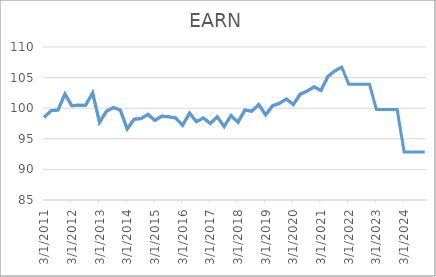
| Category | EARN | GDP |
|---|---|---|
| 3/31/11 | 98.5 |  |
| 6/30/11 | 99.6 |  |
| 9/30/11 | 99.7 |  |
| 12/31/11 | 102.3 |  |
| 3/31/12 | 100.4 |  |
| 6/30/12 | 100.5 |  |
| 9/30/12 | 100.5 |  |
| 12/31/12 | 102.5 |  |
| 3/31/13 | 97.7 |  |
| 6/30/13 | 99.5 |  |
| 9/30/13 | 100.1 |  |
| 12/31/13 | 99.7 |  |
| 3/31/14 | 96.6 |  |
| 6/30/14 | 98.2 |  |
| 9/30/14 | 98.3 |  |
| 12/31/14 | 99 |  |
| 3/31/15 | 98 |  |
| 6/30/15 | 98.7 |  |
| 9/30/15 | 98.6 |  |
| 12/31/15 | 98.4 |  |
| 3/31/16 | 97.2 |  |
| 6/30/16 | 99.2 |  |
| 9/30/16 | 97.8 |  |
| 12/31/16 | 98.4 |  |
| 3/31/17 | 97.5 |  |
| 6/30/17 | 98.6 |  |
| 9/30/17 | 97 |  |
| 12/31/17 | 98.8 |  |
| 3/31/18 | 97.7 |  |
| 6/30/18 | 99.7 |  |
| 9/30/18 | 99.5 |  |
| 12/31/18 | 100.6 |  |
| 3/31/19 | 98.9 |  |
| 6/30/19 | 100.4 |  |
| 9/30/19 | 100.8 |  |
| 12/31/19 | 101.5 |  |
| 3/31/20 | 100.6 |  |
| 6/30/20 | 102.3 |  |
| 9/30/20 | 102.8 |  |
| 12/31/20 | 103.5 |  |
| 3/31/21 | 102.9 |  |
| 6/30/21 | 105.2 |  |
| 9/30/21 | 106.1 |  |
| 12/31/21 | 106.7 |  |
| 3/31/22 | 103.926 |  |
| 6/30/22 | 103.926 |  |
| 9/30/22 | 103.926 |  |
| 12/31/22 | 103.926 |  |
| 3/31/23 | 99.788 |  |
| 6/30/23 | 99.788 |  |
| 9/30/23 | 99.788 |  |
| 12/31/23 | 99.788 |  |
| 3/31/24 | 92.864 |  |
| 6/30/24 | 92.864 |  |
| 9/30/24 | 92.864 |  |
| 12/31/24 | 92.864 |  |